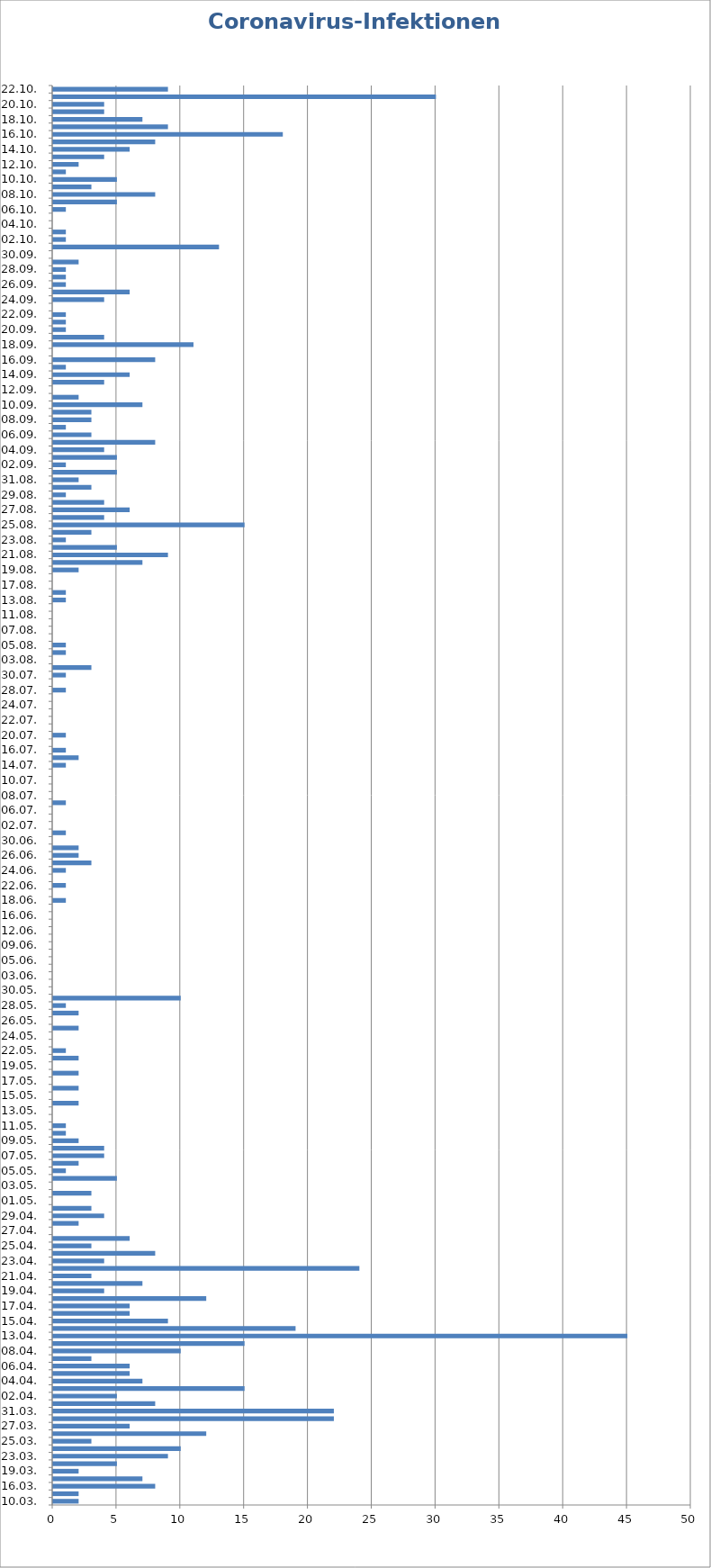
| Category | Infektionen
neu |
|---|---|
| 10.03. | 2 |
| 13.03. | 2 |
| 16.03. | 8 |
| 18.03. | 7 |
| 19.03. | 2 |
| 20.03. | 5 |
| 23.03. | 9 |
| 24.03. | 10 |
| 25.03. | 3 |
| 26.03. | 12 |
| 27.03. | 6 |
| 30.03. | 22 |
| 31.03. | 22 |
| 01.04. | 8 |
| 02.04. | 5 |
| 03.04. | 15 |
| 04.04. | 7 |
| 05.04. | 6 |
| 06.04. | 6 |
| 07.04. | 3 |
| 08.04. | 10 |
| 09.04. | 15 |
| 13.04. | 45 |
| 14.04. | 19 |
| 15.04. | 9 |
| 16.04. | 6 |
| 17.04. | 6 |
| 18.04. | 12 |
| 19.04. | 4 |
| 20.04. | 7 |
| 21.04. | 3 |
| 22.04. | 24 |
| 23.04. | 4 |
| 24.04. | 8 |
| 25.04. | 3 |
| 26.04. | 6 |
| 27.04. | 0 |
| 28.04. | 2 |
| 29.04. | 4 |
| 30.04. | 3 |
| 01.05. | 0 |
| 02.05. | 3 |
| 03.05. | 0 |
| 04.05. | 5 |
| 05.05. | 1 |
| 06.05. | 2 |
| 07.05. | 4 |
| 08.05. | 4 |
| 09.05. | 2 |
| 10.05. | 1 |
| 11.05. | 1 |
| 12.05. | 0 |
| 13.05. | 0 |
| 14.05. | 2 |
| 15.05. | 0 |
| 16.05. | 2 |
| 17.05. | 0 |
| 18.05. | 2 |
| 19.05. | 0 |
| 20.05. | 2 |
| 22.05. | 1 |
| 23.05. | 0 |
| 24.05. | 0 |
| 25.05. | 2 |
| 26.05. | 0 |
| 27.05. | 2 |
| 28.05. | 1 |
| 29.05. | 10 |
| 30.05. | 0 |
| 02.06. | 0 |
| 03.06. | 0 |
| 04.06. | 0 |
| 05.06. | 0 |
| 08.06. | 0 |
| 09.06. | 0 |
| 10.06. | 0 |
| 12.06. | 0 |
| 15.06. | 0 |
| 16.06. | 0 |
| 17.06. | 0 |
| 18.06. | 1 |
| 19.06. | 0 |
| 22.06. | 1 |
| 23.06. | 0 |
| 24.06. | 1 |
| 25.06. | 3 |
| 26.06. | 2 |
| 29.06. | 2 |
| 30.06. | 0 |
| 01.07. | 1 |
| 02.07. | 0 |
| 03.07. | 0 |
| 06.07. | 0 |
| 07.07. | 1 |
| 08.07. | 0 |
| 09.07. | 0 |
| 10.07. | 0 |
| 13.07. | 0 |
| 14.07. | 1 |
| 15.07. | 2 |
| 16.07. | 1 |
| 17.07. | 0 |
| 20.07. | 1 |
| 21.07. | 0 |
| 22.07. | 0 |
| 23.07. | 0 |
| 24.07. | 0 |
| 27.07. | 0 |
| 28.07. | 1 |
| 29.07. | 0 |
| 30.07. | 1 |
| 31.07. | 3 |
| 03.08. | 0 |
| 04.08. | 1 |
| 05.08. | 1 |
| 06.08. | 0 |
| 07.08. | 0 |
| 10.08. | 0 |
| 11.08. | 0 |
| 12.08. | 0 |
| 13.08. | 1 |
| 14.08. | 1 |
| 17.08. | 0 |
| 18.08. | 0 |
| 19.08. | 2 |
| 20.08. | 7 |
| 21.08. | 9 |
| 22.08. | 5 |
| 23.08. | 1 |
| 24.08. | 3 |
| 25.08. | 15 |
| 26.08. | 4 |
| 27.08. | 6 |
| 28.08. | 4 |
| 29.08. | 1 |
| 30.08. | 3 |
| 31.08. | 2 |
| 01.09. | 5 |
| 02.09. | 1 |
| 03.09. | 5 |
| 04.09. | 4 |
| 05.09. | 8 |
| 06.09. | 3 |
| 07.09. | 1 |
| 08.09. | 3 |
| 09.09. | 3 |
| 10.09. | 7 |
| 11.09. | 2 |
| 12.09. | 0 |
| 13.09. | 4 |
| 14.09. | 6 |
| 15.09. | 1 |
| 16.09. | 8 |
| 17.09. | 0 |
| 18.09. | 11 |
| 19.09. | 4 |
| 20.09. | 1 |
| 21.09. | 1 |
| 22.09. | 1 |
| 23.o9. | 0 |
| 24.09. | 4 |
| 25.09. | 6 |
| 26.09. | 1 |
| 27.09. | 1 |
| 28.09. | 1 |
| 29.09. | 2 |
| 30.09. | 0 |
| 01.10. | 13 |
| 02.10. | 1 |
| 03.10. | 1 |
| 04.10. | 0 |
| 05.10. | 0 |
| 06.10. | 1 |
| 07.10. | 5 |
| 08.10. | 8 |
| 09.10. | 3 |
| 10.10. | 5 |
| 11.10. | 1 |
| 12.10. | 2 |
| 13.10. | 4 |
| 14.10. | 6 |
| 15.10. | 8 |
| 16.10. | 18 |
| 17.10. | 9 |
| 18.10. | 7 |
| 19.10. | 4 |
| 20.10. | 4 |
| 21.10. | 30 |
| 22.10. | 9 |